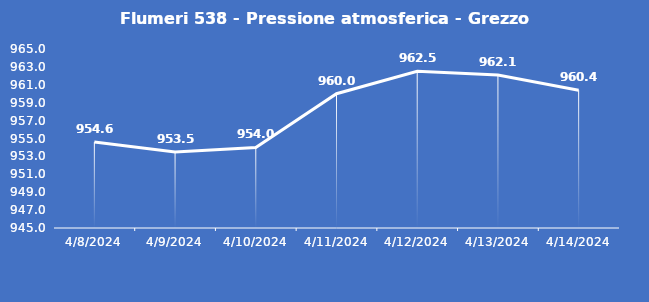
| Category | Flumeri 538 - Pressione atmosferica - Grezzo (hPa) |
|---|---|
| 4/8/24 | 954.6 |
| 4/9/24 | 953.5 |
| 4/10/24 | 954 |
| 4/11/24 | 960 |
| 4/12/24 | 962.5 |
| 4/13/24 | 962.1 |
| 4/14/24 | 960.4 |